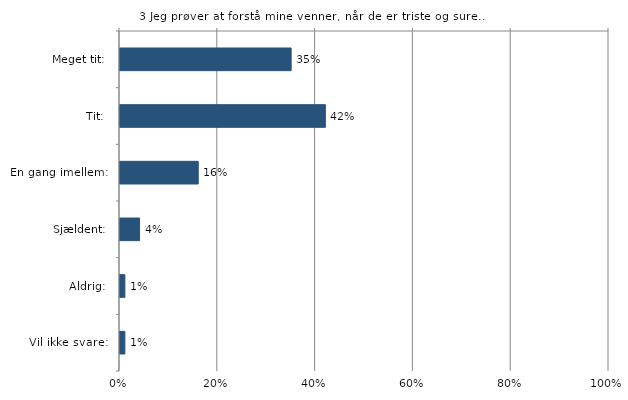
| Category | Jeg prøver at forstå mine venner, når de er triste og sure. |
|---|---|
| Meget tit:  | 0.35 |
| Tit:  | 0.42 |
| En gang imellem:  | 0.16 |
| Sjældent:  | 0.04 |
| Aldrig:  | 0.01 |
| Vil ikke svare:  | 0.01 |